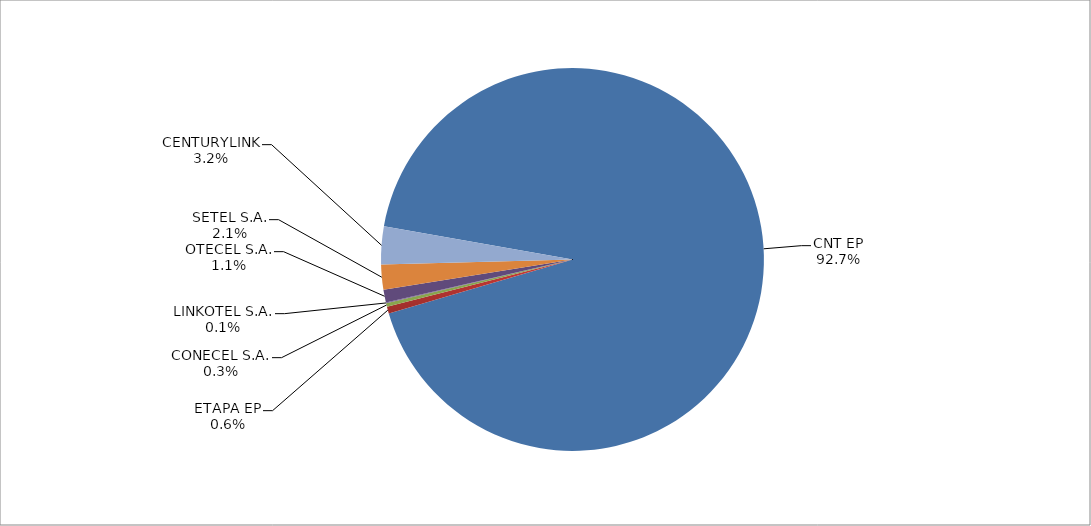
| Category | Series 0 |
|---|---|
| CNT EP | 2843 |
| ETAPA EP | 18 |
| CONECEL S.A. | 9 |
| LINKOTEL S.A. | 2 |
| OTECEL S.A. | 33 |
| SETEL S.A. | 65 |
| CENTURYLINK | 98 |